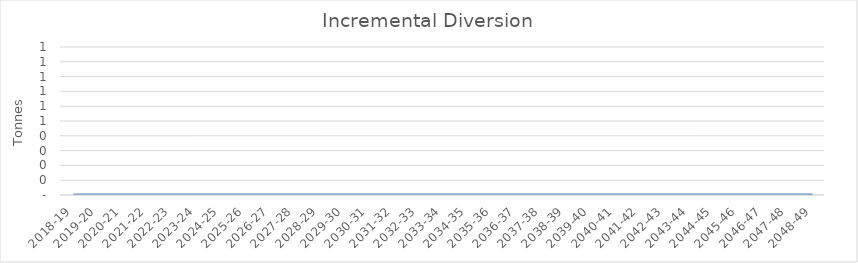
| Category | Series 0 |
|---|---|
| 2018-19 | 0 |
| 2019-20 | 0 |
| 2020-21 | 0 |
| 2021-22 | 0 |
| 2022-23 | 0 |
| 2023-24 | 0 |
| 2024-25 | 0 |
| 2025-26 | 0 |
| 2026-27 | 0 |
| 2027-28 | 0 |
| 2028-29 | 0 |
| 2029-30 | 0 |
| 2030-31 | 0 |
| 2031-32 | 0 |
| 2032-33 | 0 |
| 2033-34 | 0 |
| 2034-35 | 0 |
| 2035-36 | 0 |
| 2036-37 | 0 |
| 2037-38 | 0 |
| 2038-39 | 0 |
| 2039-40 | 0 |
| 2040-41 | 0 |
| 2041-42 | 0 |
| 2042-43 | 0 |
| 2043-44 | 0 |
| 2044-45 | 0 |
| 2045-46 | 0 |
| 2046-47 | 0 |
| 2047-48 | 0 |
| 2048-49 | 0 |